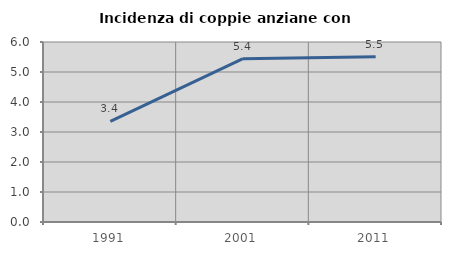
| Category | Incidenza di coppie anziane con figli |
|---|---|
| 1991.0 | 3.355 |
| 2001.0 | 5.446 |
| 2011.0 | 5.511 |